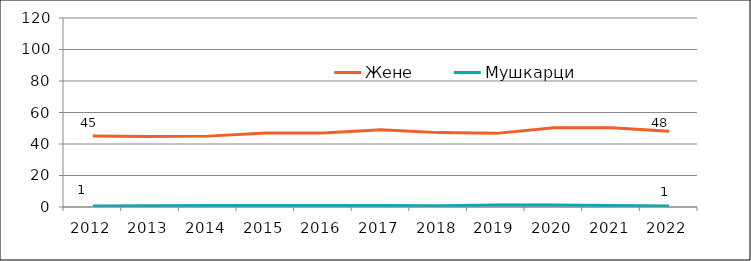
| Category | Жене | Мушкарци |
|---|---|---|
| 2012.0 | 45.027 | 0.713 |
| 2013.0 | 44.808 | 0.86 |
| 2014.0 | 45 | 1 |
| 2015.0 | 47 | 1 |
| 2016.0 | 47 | 1 |
| 2017.0 | 49.041 | 0.877 |
| 2018.0 | 47.223 | 0.853 |
| 2019.0 | 46.75 | 1.212 |
| 2020.0 | 50.356 | 1.28 |
| 2021.0 | 50.323 | 0.902 |
| 2022.0 | 48.078 | 0.586 |